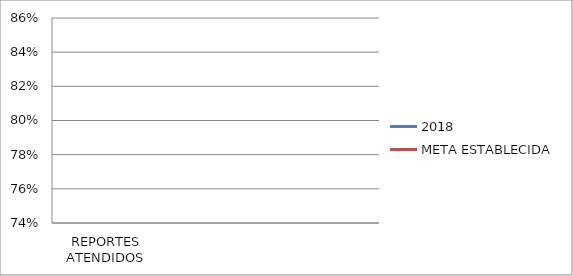
| Category | 2018 | META ESTABLECIDA |
|---|---|---|
| REPORTES ATENDIDOS | 0.78 | 0.85 |